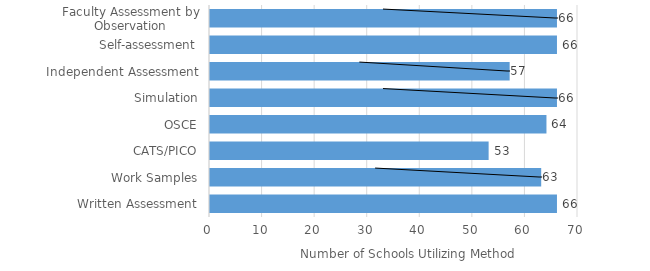
| Category | Number of schools utilizing |
|---|---|
| Written Assessment | 66 |
| Work Samples | 63 |
| CATS/PICO | 53 |
| OSCE | 64 |
| Simulation | 66 |
| Independent Assessment | 57 |
| Self-assessment | 66 |
| Faculty Assessment by Observation | 66 |